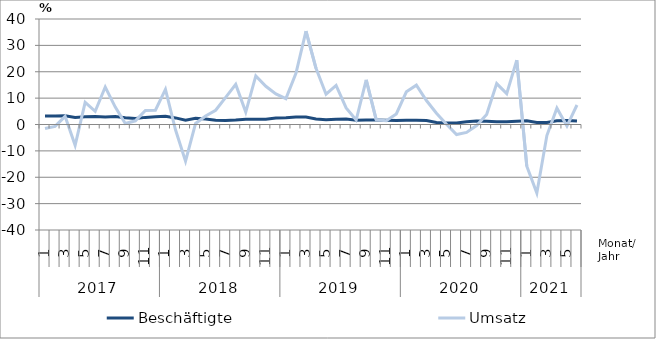
| Category | Beschäftigte | Umsatz |
|---|---|---|
| 0 | 3.2 | -1.5 |
| 1 | 3.2 | -0.7 |
| 2 | 3.3 | 3.1 |
| 3 | 2.7 | -7.9 |
| 4 | 2.9 | 8.4 |
| 5 | 3 | 5 |
| 6 | 2.8 | 14.2 |
| 7 | 3 | 6.6 |
| 8 | 2.6 | 0.4 |
| 9 | 2.3 | 1.4 |
| 10 | 2.7 | 5.3 |
| 11 | 2.9 | 5.4 |
| 12 | 3.1 | 13.3 |
| 13 | 2.5 | -2 |
| 14 | 1.6 | -13.9 |
| 15 | 2.4 | 0.4 |
| 16 | 2.1 | 3.2 |
| 17 | 1.6 | 5.4 |
| 18 | 1.5 | 10.3 |
| 19 | 1.7 | 15.2 |
| 20 | 2 | 4.7 |
| 21 | 2 | 18.4 |
| 22 | 2 | 14.5 |
| 23 | 2.5 | 11.6 |
| 24 | 2.6 | 9.8 |
| 25 | 2.8 | 19.4 |
| 26 | 2.8 | 35.4 |
| 27 | 2.1 | 21.3 |
| 28 | 1.8 | 11.5 |
| 29 | 2 | 14.8 |
| 30 | 2.1 | 6.3 |
| 31 | 1.6 | 1.7 |
| 32 | 1.7 | 16.9 |
| 33 | 1.7 | 1.8 |
| 34 | 1.6 | 1.4 |
| 35 | 1.5 | 4 |
| 36 | 1.6 | 12.4 |
| 37 | 1.6 | 14.9 |
| 38 | 1.5 | 9.1 |
| 39 | 0.8 | 4.3 |
| 40 | 0.6 | 0.1 |
| 41 | 0.6 | -3.8 |
| 42 | 1 | -3 |
| 43 | 1.3 | -0.4 |
| 44 | 1.2 | 3.8 |
| 45 | 1 | 15.5 |
| 46 | 1 | 11.7 |
| 47 | 1.2 | 24.4 |
| 48 | 1.4 | -15.8 |
| 49 | 0.8 | -26 |
| 50 | 0.8 | -4.2 |
| 51 | 1.4 | 6.2 |
| 52 | 1.5 | -0.6 |
| 53 | 1.3 | 7.4 |